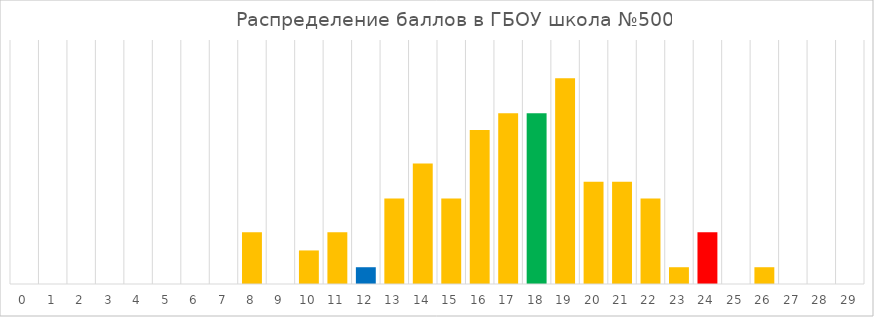
| Category | ГБОУ СОШ №500 |
|---|---|
| 0.0 | 0 |
| 1.0 | 0 |
| 2.0 | 0 |
| 3.0 | 0 |
| 4.0 | 0 |
| 5.0 | 0 |
| 6.0 | 0 |
| 7.0 | 0 |
| 8.0 | 3.4 |
| 9.0 | 0 |
| 10.0 | 2.2 |
| 11.0 | 3.4 |
| 12.0 | 1.1 |
| 13.0 | 5.6 |
| 14.0 | 7.9 |
| 15.0 | 5.6 |
| 16.0 | 10.1 |
| 17.0 | 11.2 |
| 18.0 | 11.2 |
| 19.0 | 13.5 |
| 20.0 | 6.7 |
| 21.0 | 6.7 |
| 22.0 | 5.6 |
| 23.0 | 1.1 |
| 24.0 | 3.4 |
| 25.0 | 0 |
| 26.0 | 1.1 |
| 27.0 | 0 |
| 28.0 | 0 |
| 29.0 | 0 |